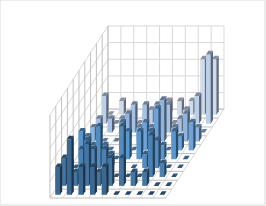
| Category | Series 0 | Series 1 | Series 2 | Series 3 | Series 4 | Series 5 | Series 6 | Series 7 | Series 8 | Series 9 |
|---|---|---|---|---|---|---|---|---|---|---|
| 0 | 0 | 0.017 | 0.008 | 0.008 | 0.008 | 0.017 | 0 | 0.008 | 0.017 | 0.017 |
| 1 | 0.008 | 0 | 0.008 | 0 | 0 | 0.008 | 0.017 | 0.017 | 0.008 | 0.033 |
| 2 | 0 | 0 | 0.008 | 0 | 0 | 0.008 | 0.025 | 0.017 | 0.025 | 0.017 |
| 3 | 0 | 0 | 0.017 | 0.017 | 0.017 | 0 | 0.008 | 0.017 | 0.008 | 0.017 |
| 4 | 0 | 0.008 | 0.017 | 0.008 | 0 | 0.017 | 0.025 | 0 | 0.017 | 0.017 |
| 5 | 0.008 | 0.008 | 0.017 | 0.008 | 0.017 | 0.017 | 0 | 0 | 0.017 | 0 |
| 6 | 0.008 | 0 | 0.017 | 0.025 | 0.025 | 0.017 | 0.008 | 0 | 0.008 | 0 |
| 7 | 0.008 | 0.008 | 0.008 | 0.008 | 0 | 0.008 | 0.017 | 0.025 | 0.008 | 0 |
| 8 | 0.033 | 0.017 | 0 | 0.017 | 0.008 | 0.017 | 0 | 0.008 | 0 | 0 |
| 9 | 0.033 | 0.042 | 0 | 0.008 | 0.017 | 0 | 0 | 0 | 0 | 0 |